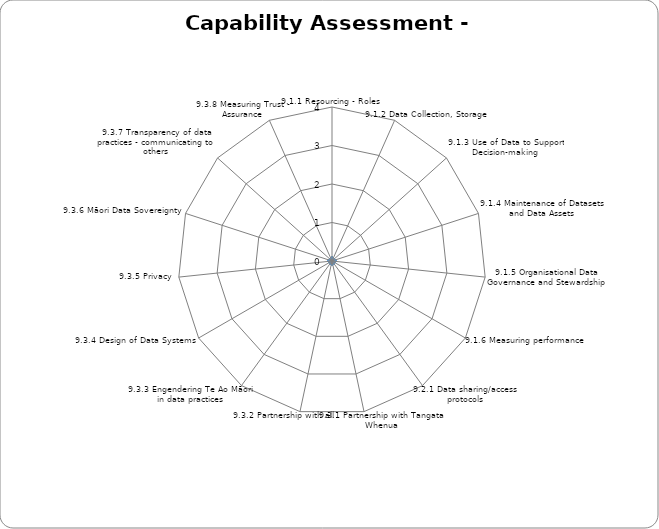
| Category | Series 0 |
|---|---|
| 9.1.1 Resourcing - Roles | 0 |
| 9.1.2 Data Collection, Storage | 0 |
| 9.1.3 Use of Data to Support Decision-making | 0 |
| 9.1.4 Maintenance of Datasets and Data Assets | 0 |
| 9.1.5 Organisational Data Governance and Stewardship | 0 |
| 9.1.6 Measuring performance | 0 |
| 9.2.1 Data sharing/access protocols | 0 |
| 9.3.1 Partnership with Tangata Whenua | 0 |
| 9.3.2 Partnership with all | 0 |
| 9.3.3 Engendering Te Ao Māori in data practices | 0 |
| 9.3.4 Design of Data Systems | 0 |
| 9.3.5 Privacy  | 0 |
| 9.3.6 Māori Data Sovereignty | 0 |
| 9.3.7 Transparency of data practices - communicating to others | 0 |
| 9.3.8 Measuring Trust - Assurance | 0 |